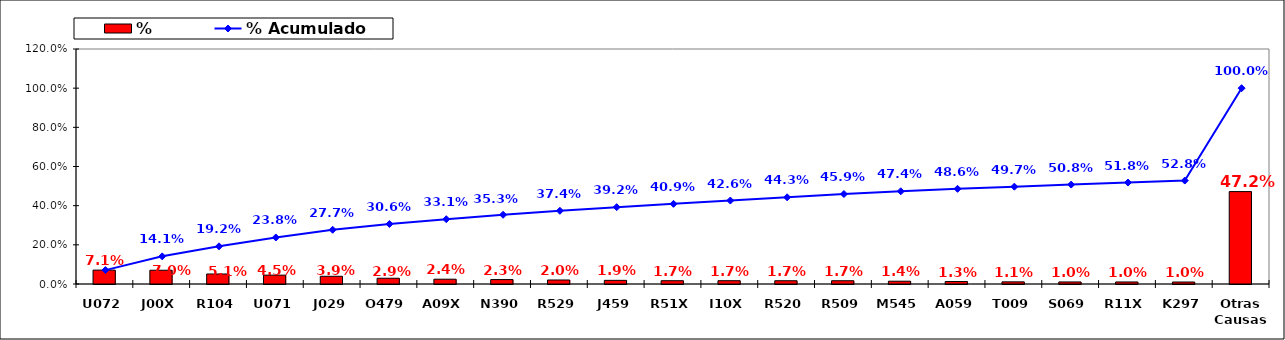
| Category | % |
|---|---|
| U072 | 0.071 |
| J00X | 0.07 |
| R104 | 0.051 |
| U071 | 0.045 |
| J029 | 0.039 |
| O479 | 0.029 |
| A09X | 0.024 |
| N390 | 0.023 |
| R529 | 0.02 |
| J459 | 0.019 |
| R51X | 0.017 |
| I10X | 0.017 |
| R520 | 0.017 |
| R509 | 0.017 |
| M545 | 0.014 |
| A059 | 0.013 |
| T009 | 0.011 |
| S069 | 0.01 |
| R11X | 0.01 |
| K297 | 0.01 |
| Otras Causas | 0.472 |